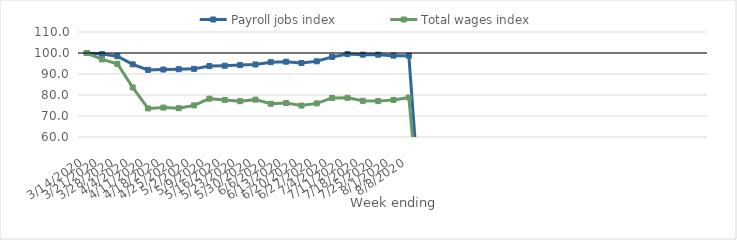
| Category | Payroll jobs index | Total wages index |
|---|---|---|
| 14/03/2020 | 100 | 100 |
| 21/03/2020 | 99.476 | 96.945 |
| 28/03/2020 | 98.476 | 94.857 |
| 04/04/2020 | 94.596 | 83.619 |
| 11/04/2020 | 91.958 | 73.611 |
| 18/04/2020 | 92.125 | 74.015 |
| 25/04/2020 | 92.278 | 73.722 |
| 02/05/2020 | 92.45 | 75.059 |
| 09/05/2020 | 93.77 | 78.264 |
| 16/05/2020 | 93.939 | 77.656 |
| 23/05/2020 | 94.228 | 77.047 |
| 30/05/2020 | 94.533 | 77.792 |
| 06/06/2020 | 95.63 | 75.836 |
| 13/06/2020 | 95.867 | 76.17 |
| 20/06/2020 | 95.245 | 74.973 |
| 27/06/2020 | 96.046 | 76.007 |
| 04/07/2020 | 98.141 | 78.604 |
| 11/07/2020 | 99.507 | 78.666 |
| 18/07/2020 | 99.209 | 77.229 |
| 25/07/2020 | 99.198 | 77.084 |
| 01/08/2020 | 98.749 | 77.659 |
| 08/08/2020 | 98.708 | 78.818 |